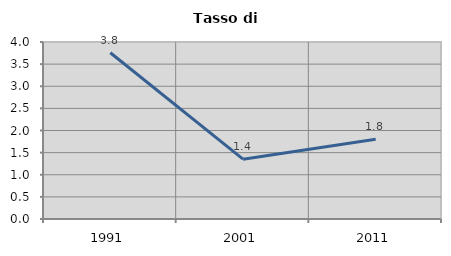
| Category | Tasso di disoccupazione   |
|---|---|
| 1991.0 | 3.758 |
| 2001.0 | 1.351 |
| 2011.0 | 1.801 |